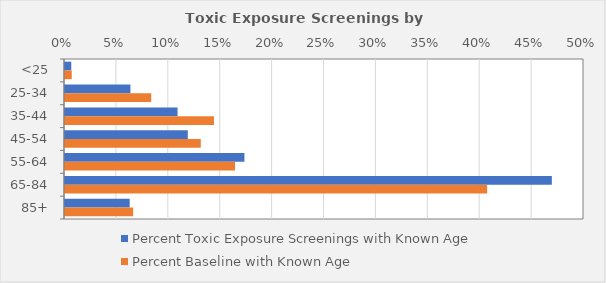
| Category | Percent Toxic Exposure Screenings with Known Age | Percent Baseline with Known Age |
|---|---|---|
| <25 | 0.006 | 0.006 |
| 25-34 | 0.063 | 0.083 |
| 35-44 | 0.108 | 0.144 |
| 45-54 | 0.118 | 0.131 |
| 55-64 | 0.173 | 0.164 |
| 65-84 | 0.469 | 0.407 |
| 85+ | 0.062 | 0.066 |